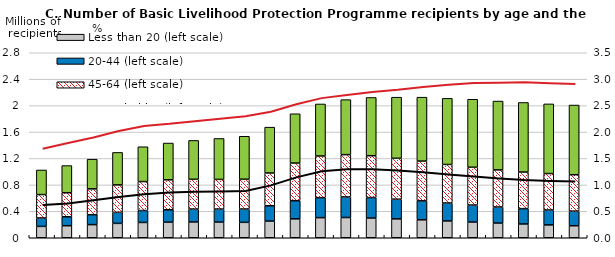
| Category | Less than 20 (left scale) | 20-44 (left scale) | 45-64 (left scale) | 65 and older (left scale) |
|---|---|---|---|---|
|  | 0.172 | 0.127 | 0.354 | 0.372 |
|  | 0.182 | 0.136 | 0.364 | 0.411 |
|  | 0.199 | 0.15 | 0.391 | 0.449 |
|  | 0.218 | 0.167 | 0.415 | 0.492 |
|  | 0.232 | 0.181 | 0.438 | 0.527 |
|  | 0.236 | 0.187 | 0.454 | 0.556 |
|  | 0.239 | 0.195 | 0.451 | 0.588 |
|  | 0.238 | 0.196 | 0.449 | 0.62 |
|  | 0.233 | 0.201 | 0.452 | 0.65 |
|  | 0.252 | 0.232 | 0.496 | 0.693 |
|  | 0.286 | 0.275 | 0.57 | 0.746 |
|  | 0.304 | 0.303 | 0.631 | 0.787 |
|  | 0.306 | 0.311 | 0.64 | 0.833 |
|  | 0.299 | 0.309 | 0.633 | 0.882 |
|  | 0.286 | 0.298 | 0.618 | 0.925 |
|  | 0.272 | 0.287 | 0.602 | 0.968 |
|  | 0.255 | 0.271 | 0.583 | 1.001 |
|  | 0.238 | 0.257 | 0.572 | 1.029 |
|  | 0.223 | 0.243 | 0.562 | 1.042 |
|  | 0.209 | 0.232 | 0.554 | 1.053 |
|  | 0.194 | 0.226 | 0.551 | 1.054 |
|  | 0.182 | 0.222 | 0.551 | 1.055 |